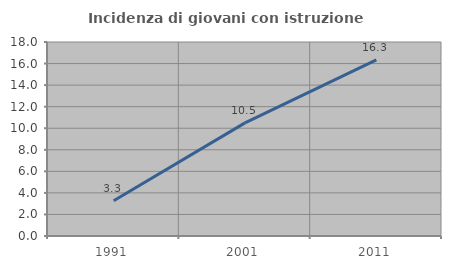
| Category | Incidenza di giovani con istruzione universitaria |
|---|---|
| 1991.0 | 3.268 |
| 2001.0 | 10.494 |
| 2011.0 | 16.34 |